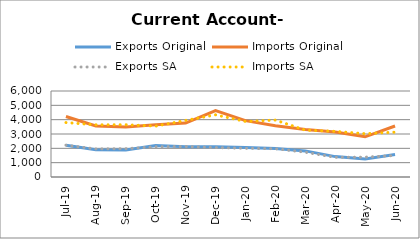
| Category | Exports Original | Imports Original | Exports SA | Imports SA |
|---|---|---|---|---|
| 2019-07-11 | 2217 | 4222 | 2220 | 3798 |
| 2019-08-11 | 1896 | 3556 | 1960 | 3640 |
| 2019-09-11 | 1881 | 3497 | 1973 | 3645 |
| 2019-10-11 | 2191 | 3648 | 2113 | 3550 |
| 2019-11-11 | 2113 | 3762 | 2130 | 3947 |
| 2019-12-11 | 2110 | 4629 | 2053 | 4339 |
| 2020-01-11 | 2056 | 3931 | 2005 | 3875 |
| 2020-02-11 | 1996 | 3581 | 1972 | 3972 |
| 2020-03-11 | 1821 | 3310 | 1732 | 3270 |
| 2020-04-11 | 1423 | 3144 | 1371 | 3185 |
| 2020-05-11 | 1259 | 2805 | 1385 | 3019 |
| 2020-06-11 | 1573 | 3560 | 1500 | 3127 |